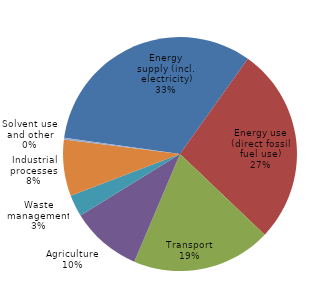
| Category | Series 0 |
|---|---|
| Energy supply (incl. electricity) | 1621.229 |
| Energy use (direct fossil fuel use) | 1354.368 |
| Transport | 958.501 |
| Agriculture | 486.809 |
| Waste management | 149.36 |
| Industrial processes | 386.775 |
| Solvent use and other | 12.011 |